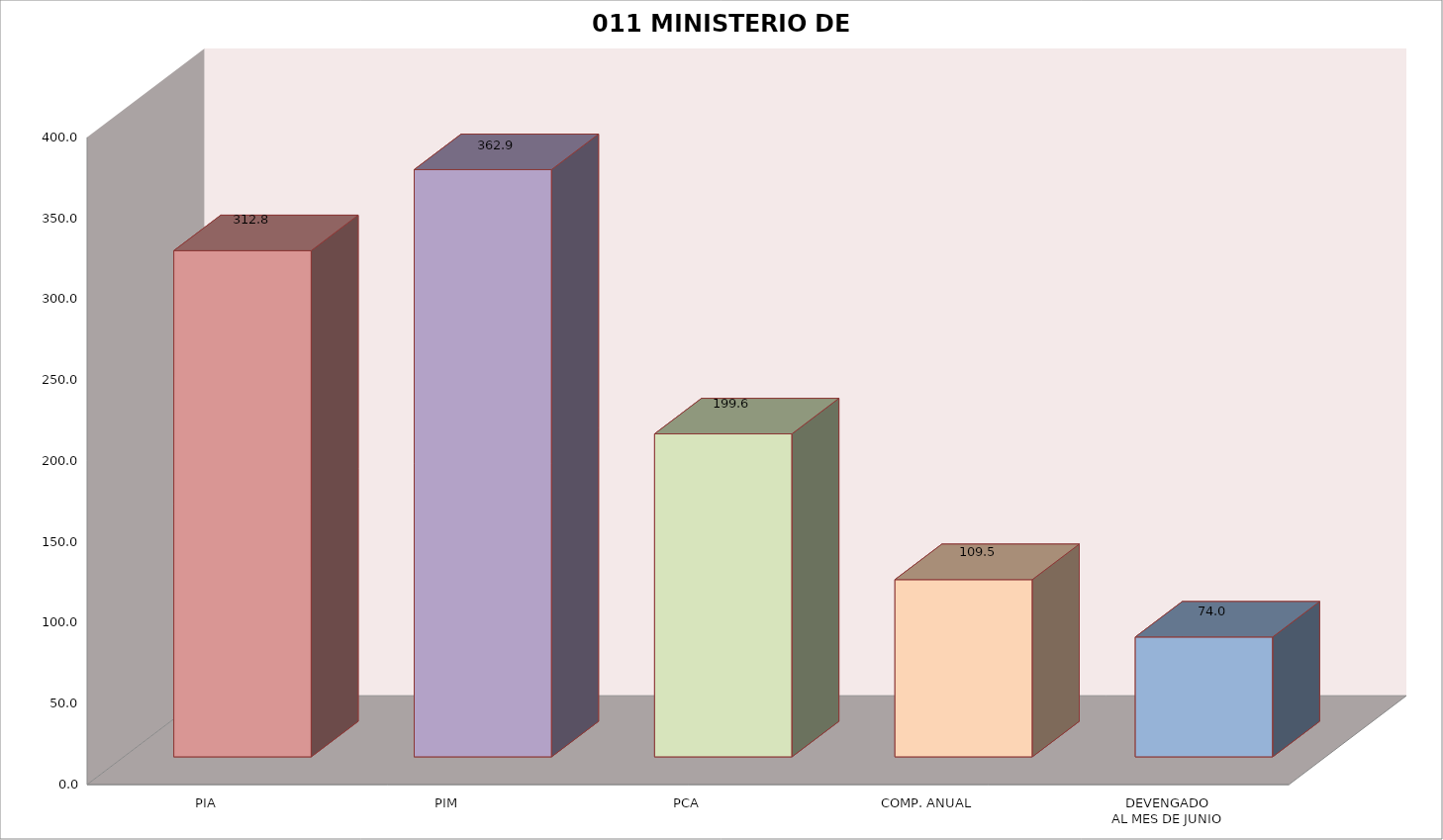
| Category | 011 MINISTERIO DE SALUD |
|---|---|
| PIA | 312.801 |
| PIM | 362.893 |
| PCA | 199.591 |
| COMP. ANUAL | 109.526 |
| DEVENGADO
AL MES DE JUNIO | 74.044 |